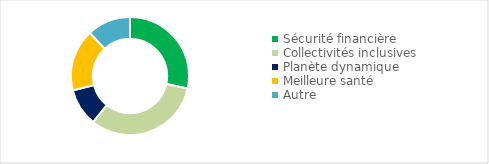
| Category | Series 0 |
|---|---|
| Sécurité financière | 0.284 |
| Collectivités inclusives | 0.323 |
| Planète dynamique | 0.103 |
| Meilleure santé | 0.17 |
| Autre | 0.119 |